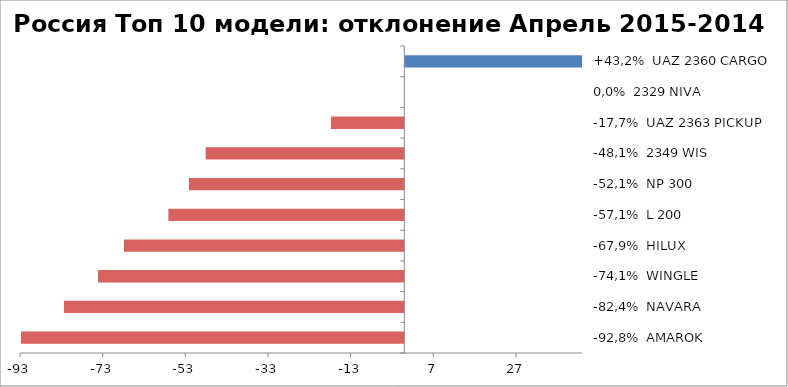
| Category | Россия Топ 10 модели: отклонение Апрель 2015-2014 |
|---|---|
| -92,8%  AMAROK | -92.757 |
| -82,4%  NAVARA | -82.353 |
| -74,1%  WINGLE | -74.138 |
| -67,9%  HILUX | -67.857 |
| -57,1%  L 200 | -57.091 |
| -52,1%  NP 300 | -52.113 |
| -48,1%  2349 WIS | -48.077 |
| -17,7%  UAZ 2363 PICKUP | -17.747 |
| 0,0%  2329 NIVA | 0 |
| +43,2%  UAZ 2360 CARGO | 43.243 |